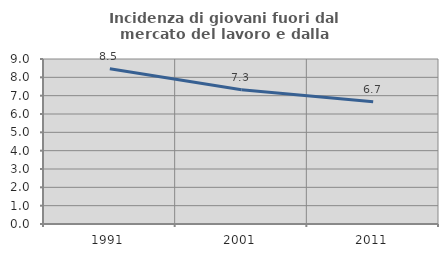
| Category | Incidenza di giovani fuori dal mercato del lavoro e dalla formazione  |
|---|---|
| 1991.0 | 8.466 |
| 2001.0 | 7.317 |
| 2011.0 | 6.667 |